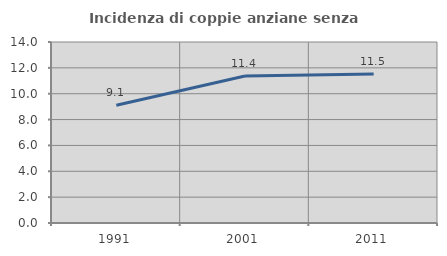
| Category | Incidenza di coppie anziane senza figli  |
|---|---|
| 1991.0 | 9.114 |
| 2001.0 | 11.369 |
| 2011.0 | 11.53 |